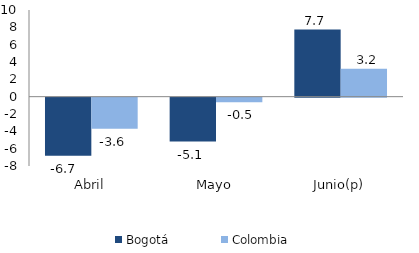
| Category | Bogotá | Colombia |
|---|---|---|
| Abril | -6.694 | -3.589 |
| Mayo | -5.063 | -0.53 |
| Junio(p) | 7.743 | 3.212 |